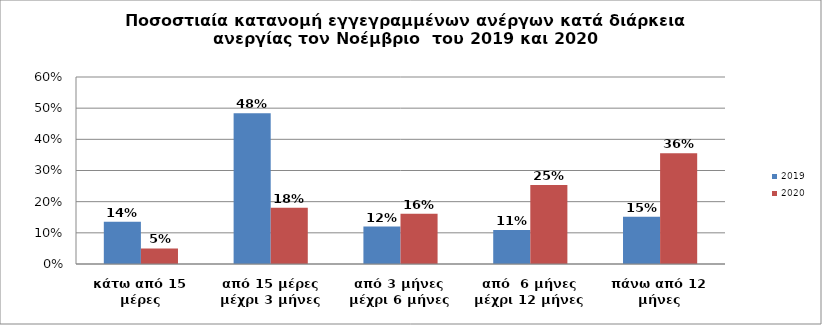
| Category | 2019 | 2020 |
|---|---|---|
| κάτω από 15 μέρες | 0.136 | 0.05 |
| από 15 μέρες μέχρι 3 μήνες | 0.484 | 0.181 |
| από 3 μήνες μέχρι 6 μήνες | 0.12 | 0.161 |
| από  6 μήνες μέχρι 12 μήνες | 0.109 | 0.253 |
| πάνω από 12 μήνες | 0.152 | 0.355 |